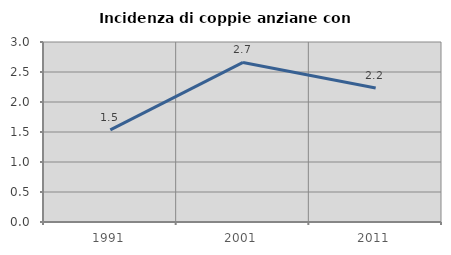
| Category | Incidenza di coppie anziane con figli |
|---|---|
| 1991.0 | 1.535 |
| 2001.0 | 2.659 |
| 2011.0 | 2.235 |